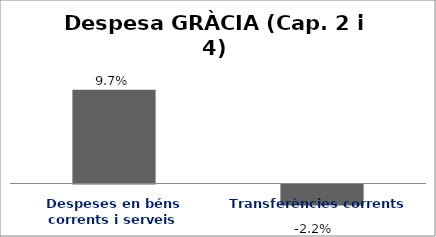
| Category | Series 0 |
|---|---|
| Despeses en béns corrents i serveis | 0.097 |
| Transferències corrents | -0.022 |